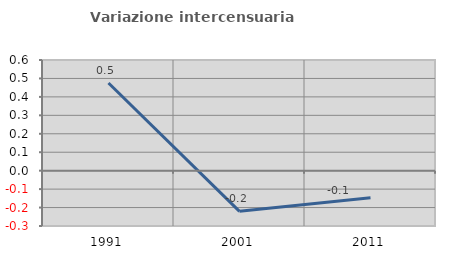
| Category | Variazione intercensuaria annua |
|---|---|
| 1991.0 | 0.475 |
| 2001.0 | -0.22 |
| 2011.0 | -0.147 |